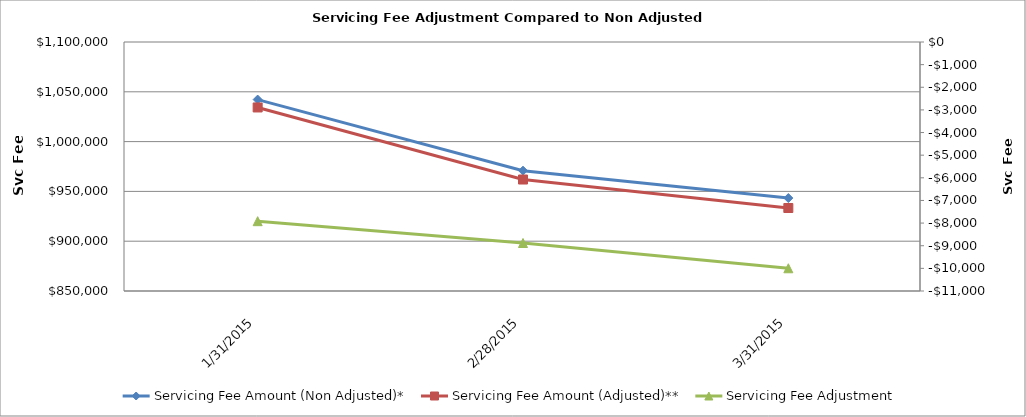
| Category | Servicing Fee Amount (Non Adjusted)* | Servicing Fee Amount (Adjusted)** |
|---|---|---|
| 1/31/15 | 1042194.76 | 1034279.32 |
| 2/28/15 | 970809.24 | 961929.74 |
| 3/31/15 | 943320.74 | 933324.96 |